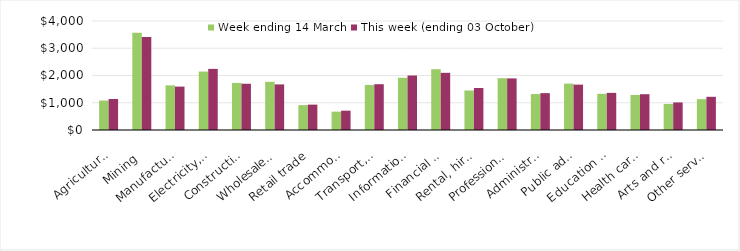
| Category | Week ending 14 March | This week (ending 03 October) |
|---|---|---|
| Agriculture, forestry and fishing | 1082.04 | 1137.25 |
| Mining | 3571.89 | 3415.26 |
| Manufacturing | 1638.05 | 1593.01 |
| Electricity, gas, water and waste services | 2143.91 | 2242.99 |
| Construction | 1727.5 | 1697.71 |
| Wholesale trade | 1768.3 | 1672.87 |
| Retail trade | 913.34 | 930.86 |
| Accommodation and food services | 673.41 | 709.14 |
| Transport, postal and warehousing | 1654.37 | 1680.38 |
| Information media and telecommunications | 1916.99 | 1999.89 |
| Financial and insurance services | 2231.04 | 2098.36 |
| Rental, hiring and real estate services | 1449.54 | 1541.59 |
| Professional, scientific and technical services | 1900.04 | 1893.14 |
| Administrative and support services | 1318.98 | 1352.83 |
| Public administration and safety | 1701.55 | 1665.05 |
| Education and training | 1327.49 | 1362.47 |
| Health care and social assistance | 1283.74 | 1313.3 |
| Arts and recreation services | 956.82 | 1011.32 |
| Other services | 1131.75 | 1218.25 |